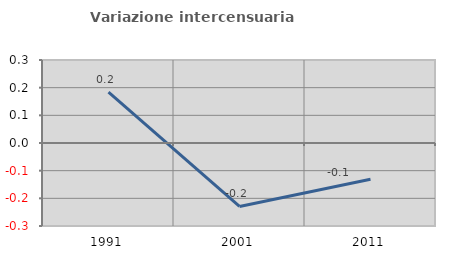
| Category | Variazione intercensuaria annua |
|---|---|
| 1991.0 | 0.184 |
| 2001.0 | -0.229 |
| 2011.0 | -0.131 |